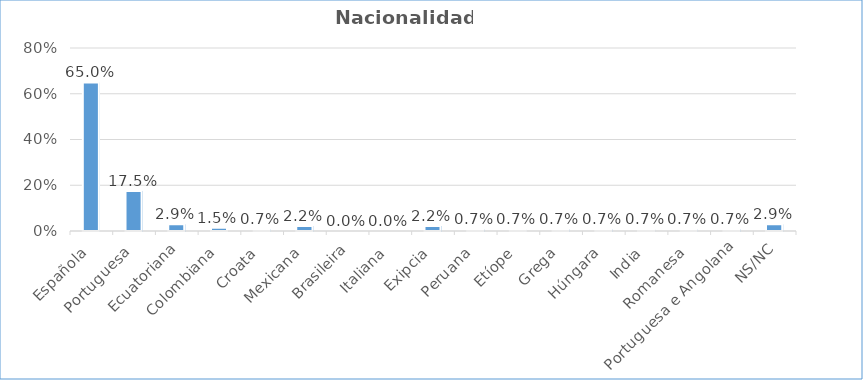
| Category | Nacionalidade |
|---|---|
| Española | 0.65 |
| Portuguesa | 0.175 |
| Ecuatoriana | 0.029 |
| Colombiana | 0.015 |
| Croata | 0.007 |
| Mexicana | 0.022 |
| Brasileira | 0 |
| Italiana | 0 |
| Exipcia | 0.022 |
| Peruana | 0.007 |
| Etíope | 0.007 |
| Grega | 0.007 |
| Húngara | 0.007 |
| India | 0.007 |
| Romanesa | 0.007 |
| Portuguesa e Angolana | 0.007 |
| NS/NC | 0.029 |